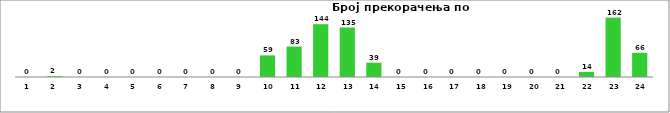
| Category | Series 0 |
|---|---|
| 0 | 0 |
| 1 | 2 |
| 2 | 0 |
| 3 | 0 |
| 4 | 0 |
| 5 | 0 |
| 6 | 0 |
| 7 | 0 |
| 8 | 0 |
| 9 | 59 |
| 10 | 83 |
| 11 | 144 |
| 12 | 135 |
| 13 | 39 |
| 14 | 0 |
| 15 | 0 |
| 16 | 0 |
| 17 | 0 |
| 18 | 0 |
| 19 | 0 |
| 20 | 0 |
| 21 | 14 |
| 22 | 162 |
| 23 | 66 |